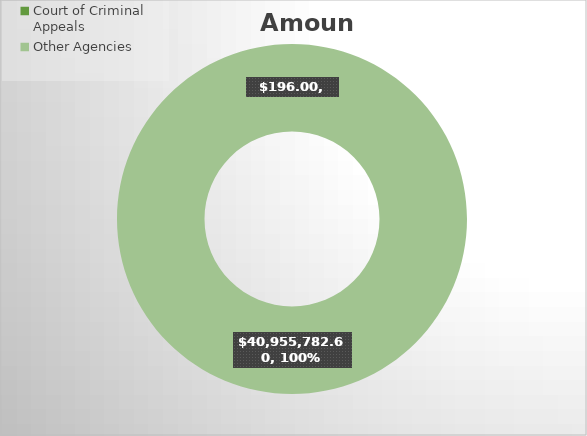
| Category | Amount |
|---|---|
| Court of Criminal Appeals | 196 |
| Other Agencies | 40955782.6 |